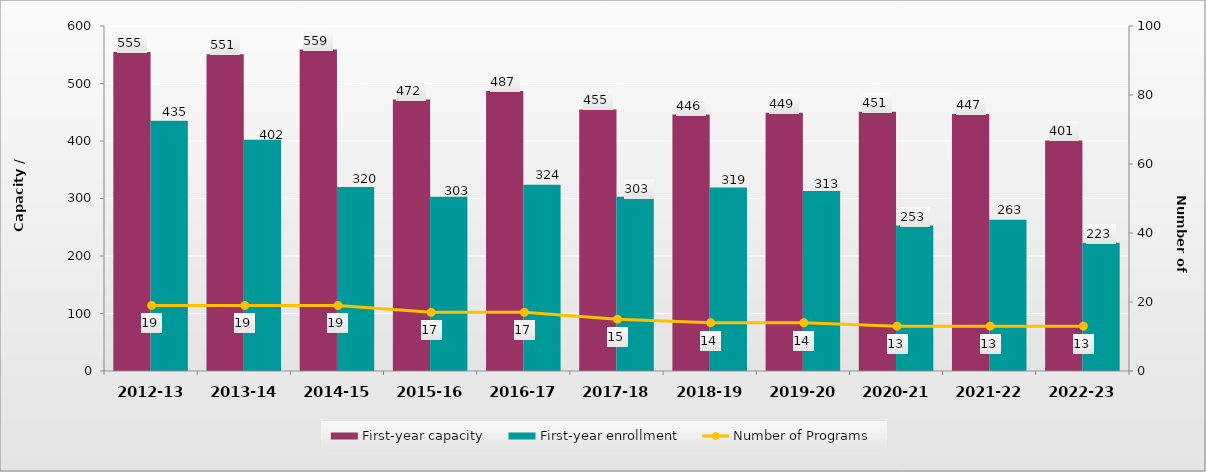
| Category | First-year capacity | First-year enrollment |
|---|---|---|
| 2012-13 | 555 | 435 |
| 2013-14 | 551 | 402 |
| 2014-15 | 559 | 320 |
| 2015-16 | 472 | 303 |
| 2016-17 | 487 | 324 |
| 2017-18 | 455 | 303 |
| 2018-19 | 446 | 319 |
| 2019-20 | 449 | 313 |
| 2020-21 | 451 | 253 |
| 2021-22 | 447 | 263 |
| 2022-23 | 401 | 223 |